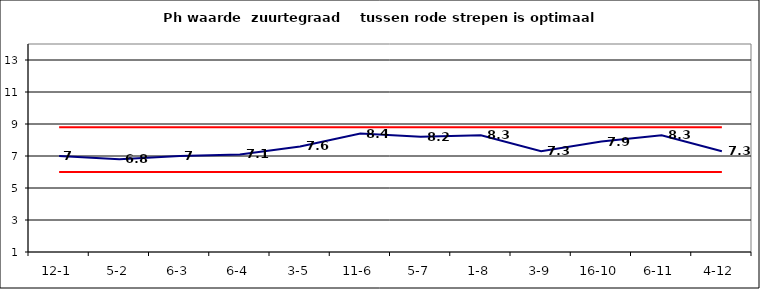
| Category | Series 0 | Series 1 | Series 2 |
|---|---|---|---|
| 12-1 | 7 | 6 | 8.8 |
| 5-2 | 6.8 | 6 | 8.8 |
| 6-3 | 7 | 6 | 8.8 |
| 6-4 | 7.1 | 6 | 8.8 |
| 3-5 | 7.6 | 6 | 8.8 |
| 11-6 | 8.4 | 6 | 8.8 |
| 5-7 | 8.2 | 6 | 8.8 |
| 1-8 | 8.3 | 6 | 8.8 |
| 3-9 | 7.3 | 6 | 8.8 |
| 16-10 | 7.9 | 6 | 8.8 |
| 6-11 | 8.3 | 6 | 8.8 |
| 4-12 | 7.3 | 6 | 8.8 |